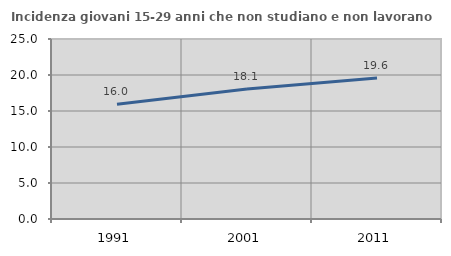
| Category | Incidenza giovani 15-29 anni che non studiano e non lavorano  |
|---|---|
| 1991.0 | 15.951 |
| 2001.0 | 18.056 |
| 2011.0 | 19.595 |